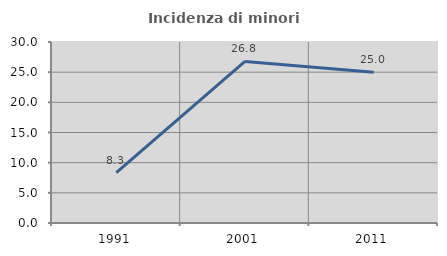
| Category | Incidenza di minori stranieri |
|---|---|
| 1991.0 | 8.333 |
| 2001.0 | 26.786 |
| 2011.0 | 25 |